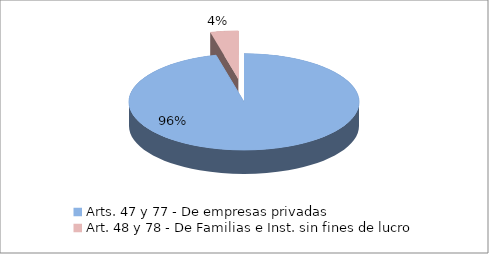
| Category | Series 0 |
|---|---|
| Arts. 47 y 77 - De empresas privadas | 5950309.43 |
| Art. 48 y 78 - De Familias e Inst. sin fines de lucro | 242232.74 |